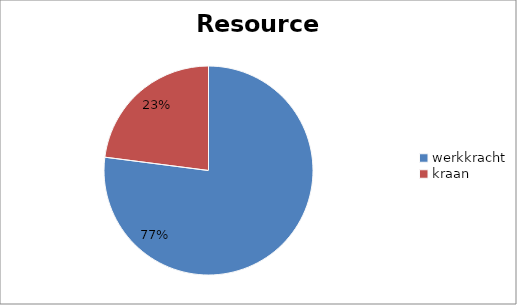
| Category | data |
|---|---|
| werkkracht | 46090.754 |
| kraan | 13740 |